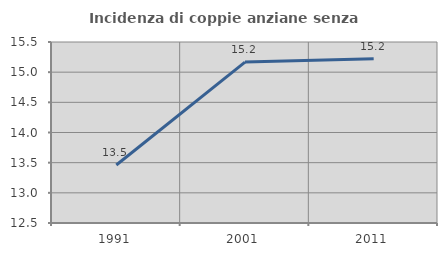
| Category | Incidenza di coppie anziane senza figli  |
|---|---|
| 1991.0 | 13.462 |
| 2001.0 | 15.167 |
| 2011.0 | 15.223 |